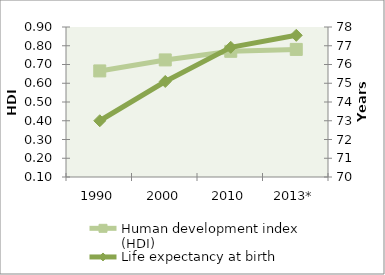
| Category | Human development index (HDI) |
|---|---|
| 1990 | 0.666 |
| 2000 | 0.724 |
| 2010 | 0.77 |
| 2013* | 0.78 |